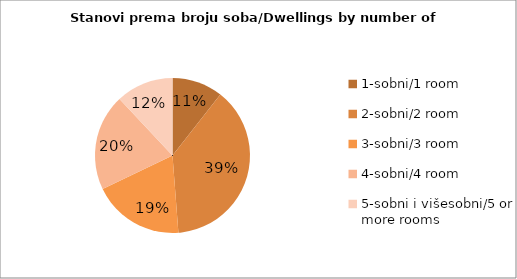
| Category | Series 0 |
|---|---|
| 1-sobni/1 room  | 61 |
| 2-sobni/2 room | 220 |
| 3-sobni/3 room | 110 |
| 4-sobni/4 room  | 116 |
| 5-sobni i višesobni/5 or more rooms  | 69 |